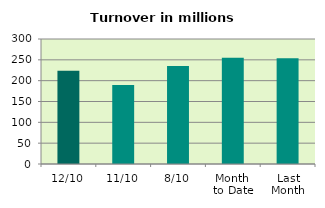
| Category | Series 0 |
|---|---|
| 12/10 | 223.82 |
| 11/10 | 189.628 |
| 8/10 | 235.164 |
| Month 
to Date | 255.216 |
| Last
Month | 253.961 |